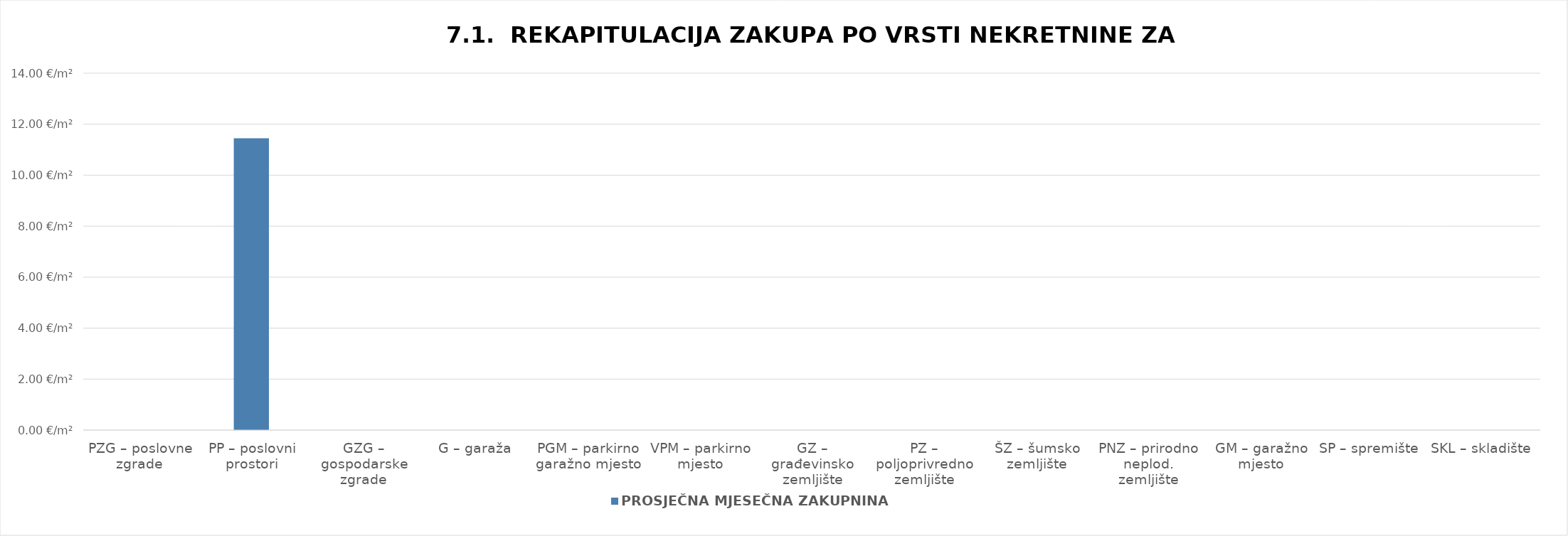
| Category | PROSJEČNA MJESEČNA ZAKUPNINA EUR/m2 |
|---|---|
| PZG – poslovne zgrade | 0 |
| PP – poslovni prostori | 1900-01-11 10:42:01 |
| GZG – gospodarske zgrade | 0 |
| G – garaža | 0 |
| PGM – parkirno garažno mjesto | 0 |
| VPM – parkirno mjesto | 0 |
| GZ – građevinsko zemljište | 0 |
| PZ – poljoprivredno zemljište | 0 |
| ŠZ – šumsko zemljište | 0 |
| PNZ – prirodno neplod. zemljište | 0 |
| GM – garažno mjesto | 0 |
| SP – spremište  | 0 |
| SKL – skladište  | 0 |